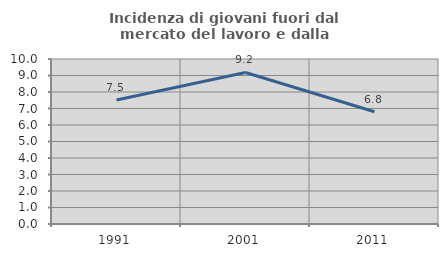
| Category | Incidenza di giovani fuori dal mercato del lavoro e dalla formazione  |
|---|---|
| 1991.0 | 7.519 |
| 2001.0 | 9.184 |
| 2011.0 | 6.806 |